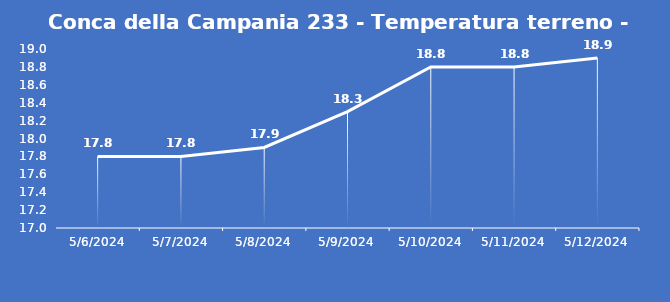
| Category | Conca della Campania 233 - Temperatura terreno - Grezzo (°C) |
|---|---|
| 5/6/24 | 17.8 |
| 5/7/24 | 17.8 |
| 5/8/24 | 17.9 |
| 5/9/24 | 18.3 |
| 5/10/24 | 18.8 |
| 5/11/24 | 18.8 |
| 5/12/24 | 18.9 |